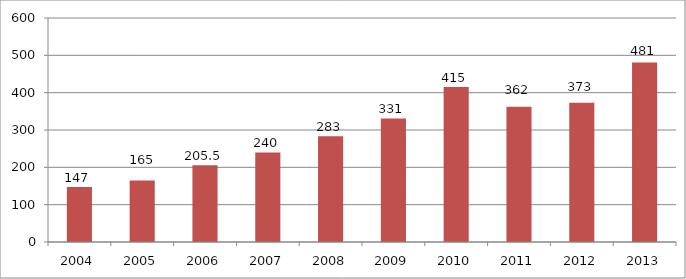
| Category | Series 1 |
|---|---|
| 2004.0 | 147 |
| 2005.0 | 165 |
| 2006.0 | 205.5 |
| 2007.0 | 240 |
| 2008.0 | 283 |
| 2009.0 | 331 |
| 2010.0 | 415 |
| 2011.0 | 362 |
| 2012.0 | 373 |
| 2013.0 | 481 |